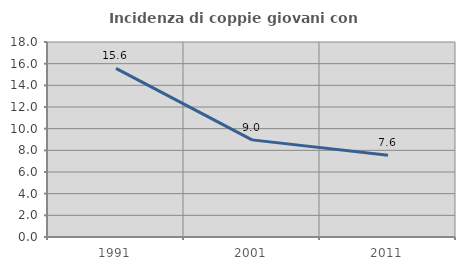
| Category | Incidenza di coppie giovani con figli |
|---|---|
| 1991.0 | 15.568 |
| 2001.0 | 8.965 |
| 2011.0 | 7.554 |